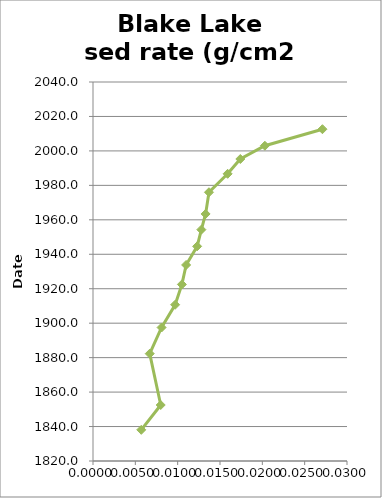
| Category | sed rate (g/cm2 yr) |
|---|---|
| 0.0271 | 2012.6 |
| 0.0203 | 2003 |
| 0.0174 | 1995.3 |
| 0.0159 | 1986.7 |
| 0.0137 | 1976 |
| 0.0133 | 1963.4 |
| 0.0128 | 1954.3 |
| 0.0123 | 1944.6 |
| 0.011 | 1933.8 |
| 0.0105 | 1922.5 |
| 0.0097 | 1910.7 |
| 0.0081 | 1897.5 |
| 0.0067 | 1882.3 |
| 0.008 | 1852.5 |
| 0.0057 | 1838.1 |